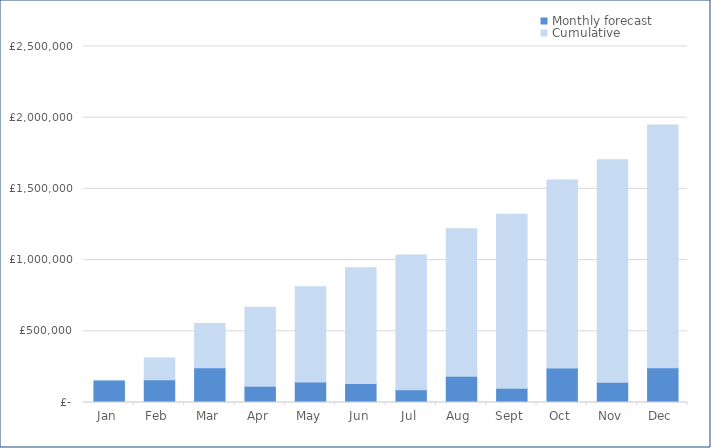
| Category | Monthly forecast | Cumulative |
|---|---|---|
| 2020-01-01 | 151600 | 0 |
| 2020-02-01 | 160320 | 151600 |
| 2020-03-01 | 243500 | 311920 |
| 2020-04-01 | 113450 | 555420 |
| 2020-05-01 | 143200 | 668870 |
| 2020-06-01 | 134000 | 812070 |
| 2020-07-01 | 89400 | 946070 |
| 2020-08-01 | 184900 | 1035470 |
| 2020-09-01 | 100800 | 1220370 |
| 2020-10-01 | 241850 | 1321170 |
| 2020-11-01 | 142425 | 1563020 |
| 2020-12-01 | 243400 | 1705445 |